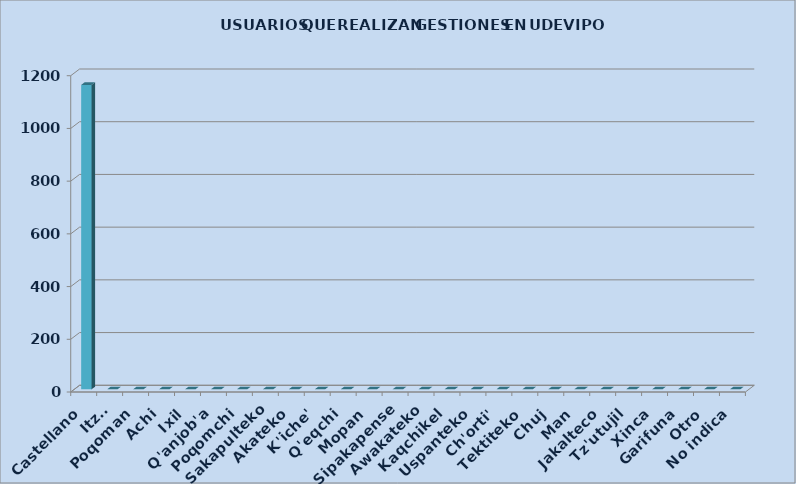
| Category | Series 0 |
|---|---|
| Castellano | 1155 |
| Itza' | 0 |
| Poqoman | 0 |
| Achi | 0 |
| Ixil | 0 |
| Q'anjob'a | 0 |
| Poqomchi | 0 |
| Sakapulteko | 0 |
| Akateko | 0 |
| K'iche' | 0 |
| Q'eqchi | 0 |
| Mopan | 0 |
| Sipakapense | 0 |
| Awakateko | 0 |
| Kaqchikel | 0 |
| Uspanteko | 0 |
| Ch'orti' | 0 |
| Tektiteko | 0 |
| Chuj | 0 |
| Man | 0 |
| Jakalteco | 0 |
| Tz'utujil | 0 |
| Xinca | 0 |
| Garifuna | 0 |
| Otro | 0 |
| No indica | 0 |